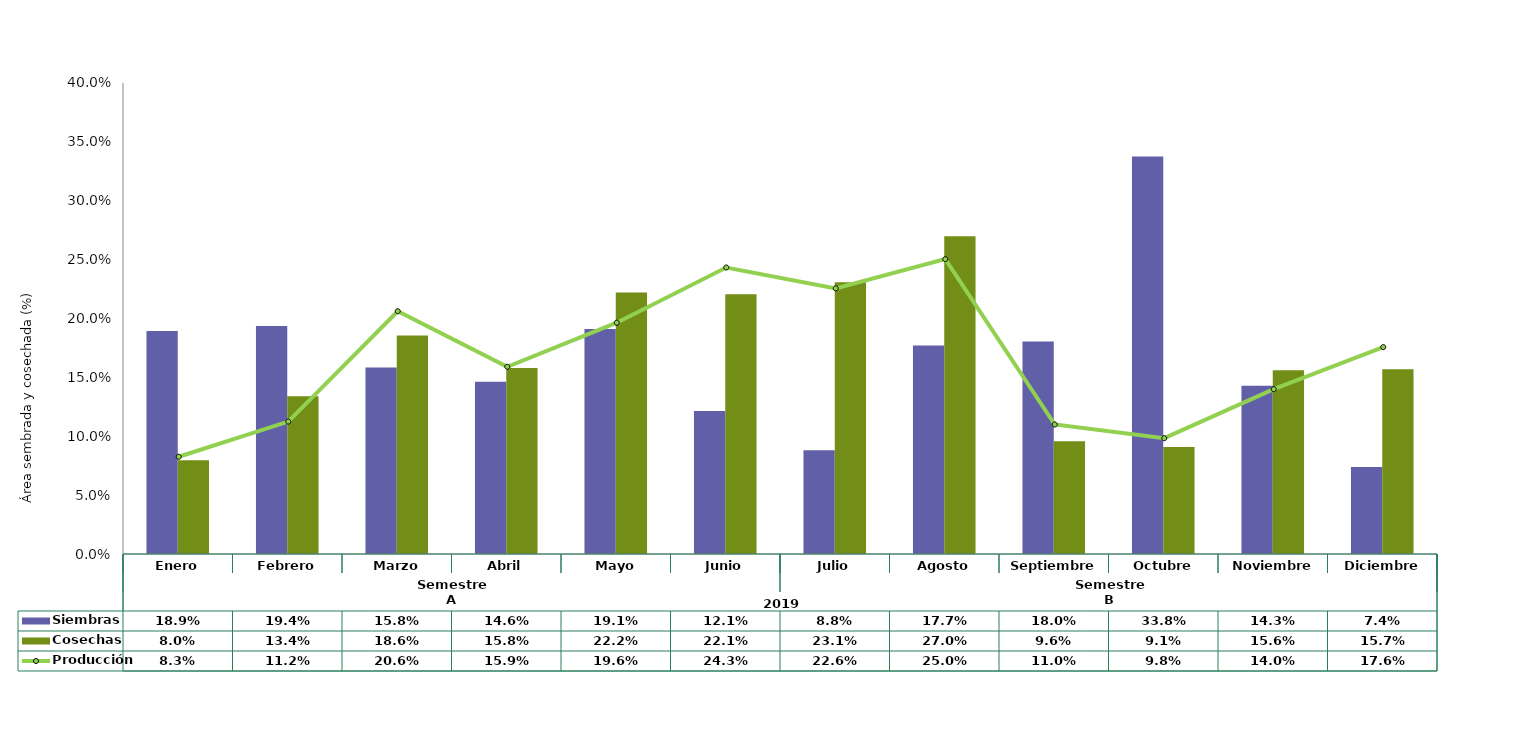
| Category | Siembras | Cosechas   |
|---|---|---|
| 0 | 0.189 | 0.08 |
| 1 | 0.194 | 0.134 |
| 2 | 0.158 | 0.186 |
| 3 | 0.146 | 0.158 |
| 4 | 0.191 | 0.222 |
| 5 | 0.121 | 0.221 |
| 6 | 0.088 | 0.231 |
| 7 | 0.177 | 0.27 |
| 8 | 0.18 | 0.096 |
| 9 | 0.338 | 0.091 |
| 10 | 0.143 | 0.156 |
| 11 | 0.074 | 0.157 |